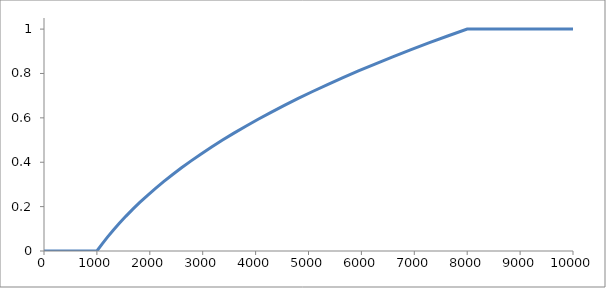
| Category | Series 0 |
|---|---|
| 0.0 | 0 |
| 1000.0 | 0 |
| 1096.710205078125 | 0.031 |
| 1199.462890625 | 0.062 |
| 1308.441162109375 | 0.094 |
| 1423.828125 | 0.125 |
| 1545.806884765625 | 0.156 |
| 1674.560546875 | 0.188 |
| 1810.272216796875 | 0.219 |
| 1953.125 | 0.25 |
| 2103.302001953125 | 0.281 |
| 2260.986328125 | 0.312 |
| 2426.361083984375 | 0.344 |
| 2599.609375 | 0.375 |
| 2780.914306640625 | 0.406 |
| 2970.458984375 | 0.438 |
| 3168.426513671875 | 0.469 |
| 3375.0 | 0.5 |
| 3590.362548828125 | 0.531 |
| 3814.697265625 | 0.562 |
| 4048.187255859375 | 0.594 |
| 4291.015625 | 0.625 |
| 4543.365478515625 | 0.656 |
| 4805.419921875 | 0.688 |
| 5077.362060546875 | 0.719 |
| 5359.375 | 0.75 |
| 5651.641845703125 | 0.781 |
| 5954.345703125 | 0.812 |
| 6267.669677734375 | 0.844 |
| 6591.796875 | 0.875 |
| 6926.910400390625 | 0.906 |
| 7273.193359375 | 0.938 |
| 7630.828857421875 | 0.969 |
| 8000.0 | 1 |
| 10000.0 | 1 |